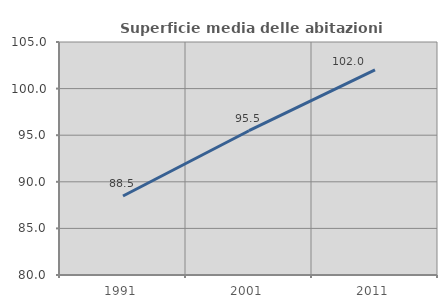
| Category | Superficie media delle abitazioni occupate |
|---|---|
| 1991.0 | 88.474 |
| 2001.0 | 95.481 |
| 2011.0 | 102.01 |